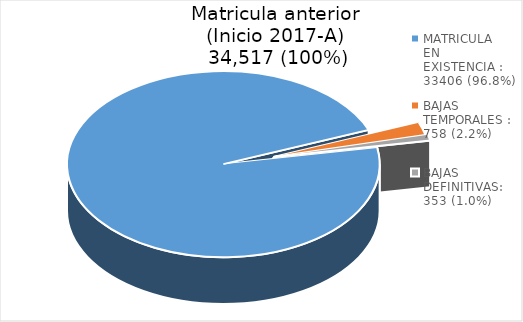
| Category | Series 0 |
|---|---|
| MATRICULA EN EXISTENCIA : 33406 (96.8%) | 96.781 |
| BAJAS TEMPORALES : 758 (2.2%) | 2.196 |
| BAJAS DEFINITIVAS: 353 (1.0%) | 1.023 |